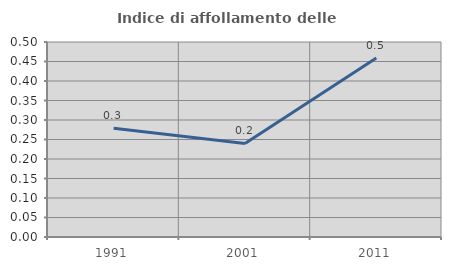
| Category | Indice di affollamento delle abitazioni  |
|---|---|
| 1991.0 | 0.279 |
| 2001.0 | 0.24 |
| 2011.0 | 0.459 |